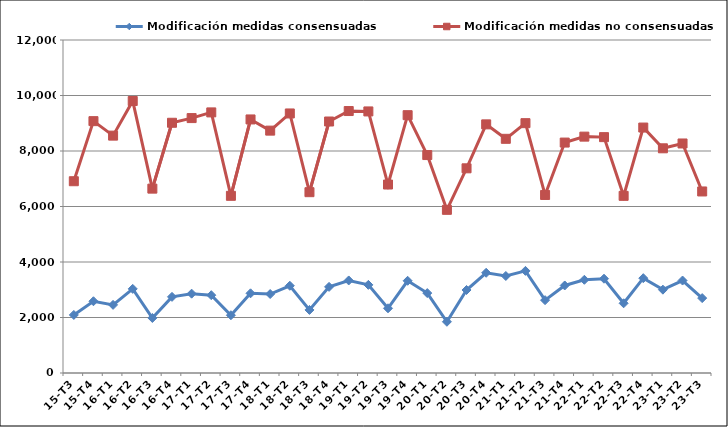
| Category | Modificación medidas consensuadas | Modificación medidas no consensuadas |
|---|---|---|
| 15-T3 | 2092 | 6911 |
| 15-T4 | 2586 | 9076 |
| 16-T1 | 2455 | 8554 |
| 16-T2 | 3032 | 9802 |
| 16-T3 | 1983 | 6644 |
| 16-T4 | 2744 | 9017 |
| 17-T1 | 2859 | 9186 |
| 17-T2 | 2804 | 9391 |
| 17-T3 | 2082 | 6385 |
| 17-T4 | 2872 | 9137 |
| 18-T1 | 2846 | 8734 |
| 18-T2 | 3144 | 9353 |
| 18-T3 | 2272 | 6516 |
| 18-T4 | 3104 | 9063 |
| 19-T1 | 3335 | 9440 |
| 19-T2 | 3176 | 9426 |
| 19-T3 | 2332 | 6792 |
| 19-T4 | 3323 | 9291 |
| 20-T1 | 2880 | 7854 |
| 20-T2 | 1846 | 5880 |
| 20-T3 | 2991 | 7376 |
| 20-T4 | 3612 | 8960 |
| 21-T1 | 3496 | 8439 |
| 21-T2 | 3680 | 9003 |
| 21-T3 | 2625 | 6416 |
| 21-T4 | 3154 | 8304 |
| 22-T1 | 3359 | 8518 |
| 22-T2 | 3398 | 8500 |
| 22-T3 | 2512 | 6384 |
| 22-T4 | 3417 | 8845 |
| 23-T1 | 3003 | 8097 |
| 23-T2 | 3332 | 8271 |
| 23-T3 | 2699 | 6542 |